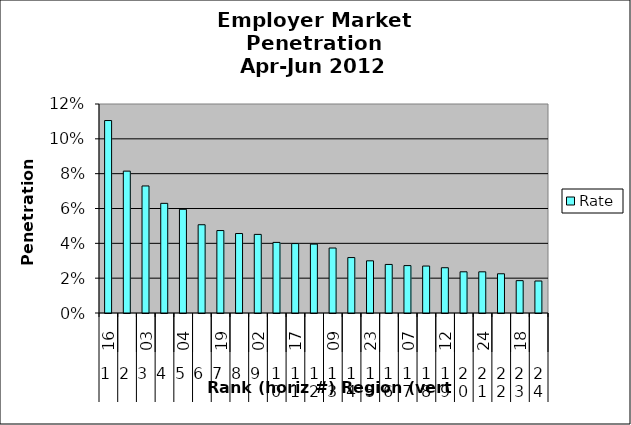
| Category | Rate |
|---|---|
| 0 | 0.111 |
| 1 | 0.081 |
| 2 | 0.073 |
| 3 | 0.063 |
| 4 | 0.06 |
| 5 | 0.051 |
| 6 | 0.047 |
| 7 | 0.046 |
| 8 | 0.045 |
| 9 | 0.041 |
| 10 | 0.04 |
| 11 | 0.04 |
| 12 | 0.037 |
| 13 | 0.032 |
| 14 | 0.03 |
| 15 | 0.028 |
| 16 | 0.027 |
| 17 | 0.027 |
| 18 | 0.026 |
| 19 | 0.024 |
| 20 | 0.024 |
| 21 | 0.023 |
| 22 | 0.019 |
| 23 | 0.018 |